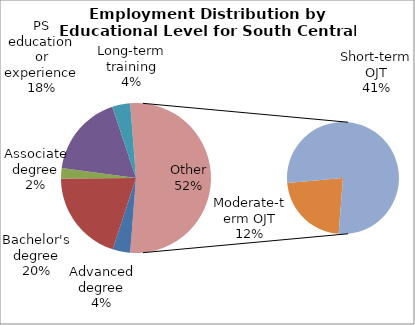
| Category | Series 0 |
|---|---|
| Advanced degree | 28900 |
| Bachelor's degree | 151270 |
| Associate degree | 16860 |
| PS education or experience | 135270 |
| Long-term training | 29590 |
| Moderate-term OJT | 89420 |
| Short-term OJT | 310330 |